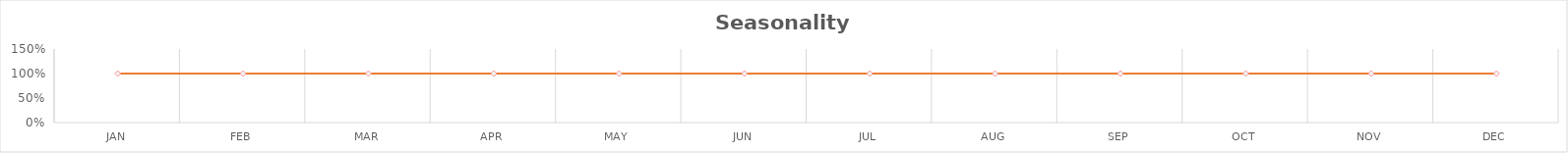
| Category | Series 0 |
|---|---|
| JAN | 1 |
| FEB | 1 |
| MAR | 1 |
| APR | 1 |
| MAY | 1 |
| JUN | 1 |
| JUL | 1 |
| AUG | 1 |
| SEP | 1 |
| OCT | 1 |
| NOV | 1 |
| DEC | 1 |